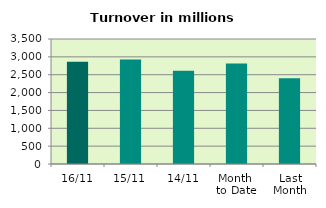
| Category | Series 0 |
|---|---|
| 16/11 | 2864.719 |
| 15/11 | 2929.193 |
| 14/11 | 2609.148 |
| Month 
to Date | 2811.527 |
| Last
Month | 2399.244 |